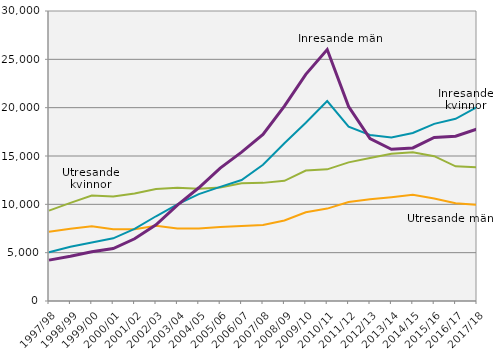
| Category | Utresande kvinnor | Utresande män | Inresande kvinnor | Inresande män |
|---|---|---|---|---|
| 1997/98 | 9348 | 7166 | 5051 | 4230 |
| 1998/99 | 10145 | 7471 | 5612 | 4631 |
| 1999/00 | 10911 | 7729 | 6045 | 5089 |
| 2000/01 | 10800 | 7412 | 6484 | 5431 |
| 2001/02 | 11128 | 7417 | 7466 | 6439 |
| 2002/03 | 11585 | 7792 | 8767 | 7885 |
| 2003/04 | 11720 | 7491 | 9994 | 9921 |
| 2004/05 | 11615 | 7506 | 11052 | 11716 |
| 2005/06 | 11747 | 7660 | 11808 | 13747 |
| 2006/07 | 12189 | 7770 | 12511 | 15404 |
| 2007/08 | 12220 | 7873 | 14095 | 17223 |
| 2008/09 | 12430 | 8334 | 16325 | 20163 |
| 2009/10 | 13496 | 9178 | 18433 | 23445 |
| 2010/11 | 13621 | 9560 | 20681 | 26013 |
| 2011/12 | 14340 | 10237 | 18029 | 20115 |
| 2012/13 | 14783 | 10525 | 17169 | 16791 |
| 2013/14 | 15239 | 10742 | 16917 | 15691 |
| 2014/15 | 15381 | 10984 | 17384 | 15833 |
| 2015/16 | 14982 | 10595 | 18324 | 16914 |
| 2016/17 | 13934 | 10117 | 18853 | 17040 |
| 2017/18 | 13824 | 9947 | 20054 | 17783 |